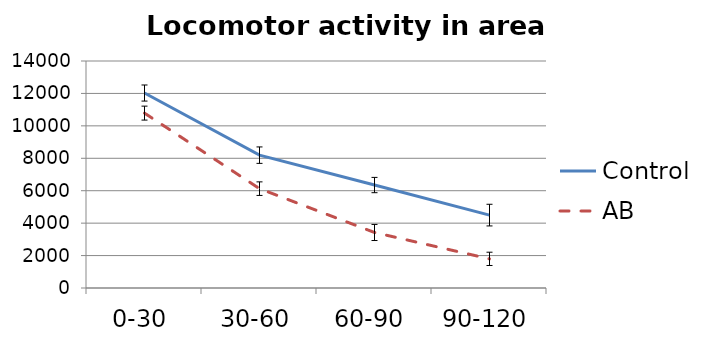
| Category | Control | AB |
|---|---|---|
| 0-30 | 12024.545 | 10786.167 |
| 30-60 | 8193.364 | 6127.5 |
| 60-90 | 6349.364 | 3424.389 |
| 90-120 | 4495.864 | 1797.333 |